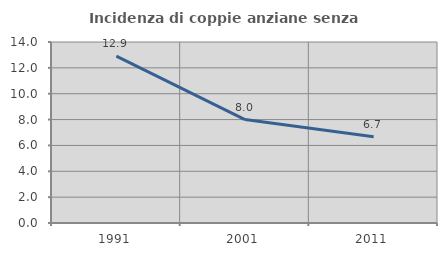
| Category | Incidenza di coppie anziane senza figli  |
|---|---|
| 1991.0 | 12.903 |
| 2001.0 | 8 |
| 2011.0 | 6.667 |